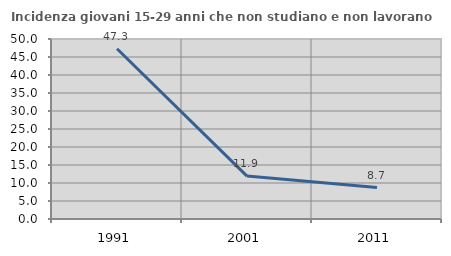
| Category | Incidenza giovani 15-29 anni che non studiano e non lavorano  |
|---|---|
| 1991.0 | 47.294 |
| 2001.0 | 11.927 |
| 2011.0 | 8.721 |